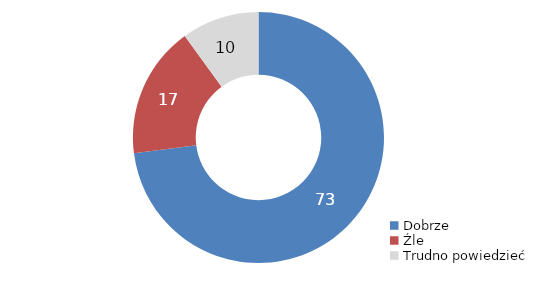
| Category | Series 0 |
|---|---|
| Dobrze | 73 |
| Źle | 17 |
| Trudno powiedzieć | 10 |